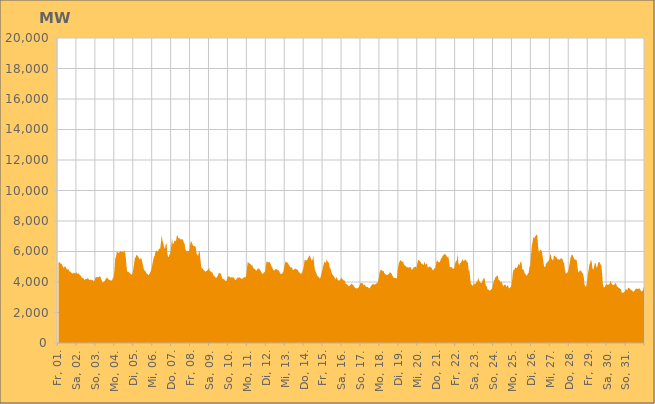
| Category | Series 0 |
|---|---|
|  Fr, 01.  | 5291.469 |
|  Fr, 01.  | 5276.043 |
|  Fr, 01.  | 5301.594 |
|  Fr, 01.  | 5173.904 |
|  Fr, 01.  | 5225.617 |
|  Fr, 01.  | 5091.954 |
|  Fr, 01.  | 4968.742 |
|  Fr, 01.  | 4932.881 |
|  Fr, 01.  | 5008.292 |
|  Fr, 01.  | 5014.87 |
|  Fr, 01.  | 4885.486 |
|  Fr, 01.  | 4801.609 |
|  Fr, 01.  | 4848.167 |
|  Fr, 01.  | 4813.785 |
|  Fr, 01.  | 4692.082 |
|  Fr, 01.  | 4688.042 |
|  Fr, 01.  | 4625.284 |
|  Sa, 02.  | 4578.245 |
|  Sa, 02.  | 4545.249 |
|  Sa, 02.  | 4586.036 |
|  Sa, 02.  | 4613.374 |
|  Sa, 02.  | 4543.371 |
|  Sa, 02.  | 4603.964 |
|  Sa, 02.  | 4637.983 |
|  Sa, 02.  | 4507.018 |
|  Sa, 02.  | 4592.123 |
|  Sa, 02.  | 4522.294 |
|  Sa, 02.  | 4466.594 |
|  Sa, 02.  | 4428.803 |
|  Sa, 02.  | 4359.241 |
|  Sa, 02.  | 4249.046 |
|  Sa, 02.  | 4277.152 |
|  Sa, 02.  | 4220.187 |
|  Sa, 02.  | 4119.785 |
|  Sa, 02.  | 4180.362 |
|  Sa, 02.  | 4197.942 |
|  Sa, 02.  | 4198.519 |
|  Sa, 02.  | 4255.213 |
|  Sa, 02.  | 4222.357 |
|  Sa, 02.  | 4127.056 |
|  Sa, 02.  | 4136.769 |
|  So, 03.  | 4172.317 |
|  So, 03.  | 4118.15 |
|  So, 03.  | 4125.26 |
|  So, 03.  | 4103.695 |
|  So, 03.  | 4032.138 |
|  So, 03.  | 4127.129 |
|  So, 03.  | 4299.63 |
|  So, 03.  | 4323.396 |
|  So, 03.  | 4300.99 |
|  So, 03.  | 4329.813 |
|  So, 03.  | 4302.576 |
|  So, 03.  | 4379.149 |
|  So, 03.  | 4378.963 |
|  So, 03.  | 4217.045 |
|  So, 03.  | 4101.995 |
|  So, 03.  | 3958.755 |
|  So, 03.  | 3994.449 |
|  So, 03.  | 4024.42 |
|  So, 03.  | 4104.761 |
|  So, 03.  | 4195.336 |
|  So, 03.  | 4278.51 |
|  So, 03.  | 4292.641 |
|  So, 03.  | 4183.957 |
|  So, 03.  | 4163.871 |
|  Mo, 04.  | 4133.741 |
|  Mo, 04.  | 4103.664 |
|  Mo, 04.  | 4103.346 |
|  Mo, 04.  | 4096.219 |
|  Mo, 04.  | 4254.713 |
|  Mo, 04.  | 4299.105 |
|  Mo, 04.  | 4738.072 |
|  Mo, 04.  | 5545.968 |
|  Mo, 04.  | 5653.292 |
|  Mo, 04.  | 5981.314 |
|  Mo, 04.  | 5961.216 |
|  Mo, 04.  | 5895.655 |
|  Mo, 04.  | 5958.478 |
|  Mo, 04.  | 5952.697 |
|  Mo, 04.  | 6036.834 |
|  Mo, 04.  | 5975.553 |
|  Mo, 04.  | 5989.244 |
|  Mo, 04.  | 5980.394 |
|  Mo, 04.  | 5938.9 |
|  Mo, 04.  | 6090.2 |
|  Mo, 04.  | 5821.564 |
|  Mo, 04.  | 5229.605 |
|  Mo, 04.  | 4706.197 |
|  Mo, 04.  | 4651.199 |
|  Di, 05.  | 4662.917 |
|  Di, 05.  | 4606.434 |
|  Di, 05.  | 4552.005 |
|  Di, 05.  | 4504.171 |
|  Di, 05.  | 4488.125 |
|  Di, 05.  | 4583.404 |
|  Di, 05.  | 4830.708 |
|  Di, 05.  | 5233.801 |
|  Di, 05.  | 5590.071 |
|  Di, 05.  | 5606.75 |
|  Di, 05.  | 5809.221 |
|  Di, 05.  | 5733.045 |
|  Di, 05.  | 5684.587 |
|  Di, 05.  | 5579.807 |
|  Di, 05.  | 5460.334 |
|  Di, 05.  | 5555.59 |
|  Di, 05.  | 5564.182 |
|  Di, 05.  | 5398.15 |
|  Di, 05.  | 5142.537 |
|  Di, 05.  | 4889.304 |
|  Di, 05.  | 4754.593 |
|  Di, 05.  | 4742.456 |
|  Di, 05.  | 4635.684 |
|  Di, 05.  | 4545.6 |
|  Mi, 06.  | 4537.559 |
|  Mi, 06.  | 4439.4 |
|  Mi, 06.  | 4503.256 |
|  Mi, 06.  | 4587.209 |
|  Mi, 06.  | 4696.493 |
|  Mi, 06.  | 4862.963 |
|  Mi, 06.  | 5138.464 |
|  Mi, 06.  | 5388.065 |
|  Mi, 06.  | 5627.184 |
|  Mi, 06.  | 5707.782 |
|  Mi, 06.  | 5960.912 |
|  Mi, 06.  | 6061.667 |
|  Mi, 06.  | 6028.991 |
|  Mi, 06.  | 5976.684 |
|  Mi, 06.  | 6119.054 |
|  Mi, 06.  | 6195.808 |
|  Mi, 06.  | 6187.889 |
|  Mi, 06.  | 6605.273 |
|  Mi, 06.  | 7073.313 |
|  Mi, 06.  | 6684.127 |
|  Mi, 06.  | 6542.447 |
|  Mi, 06.  | 6286.787 |
|  Mi, 06.  | 6184.092 |
|  Mi, 06.  | 6445.151 |
|  Do, 07.  | 6587.147 |
|  Do, 07.  | 5914.482 |
|  Do, 07.  | 5635.862 |
|  Do, 07.  | 5663.02 |
|  Do, 07.  | 5815.403 |
|  Do, 07.  | 5923.338 |
|  Do, 07.  | 6342.19 |
|  Do, 07.  | 6869.14 |
|  Do, 07.  | 6444.262 |
|  Do, 07.  | 6538.006 |
|  Do, 07.  | 6687.115 |
|  Do, 07.  | 6729.043 |
|  Do, 07.  | 6659.286 |
|  Do, 07.  | 7012.51 |
|  Do, 07.  | 7048.649 |
|  Do, 07.  | 6866.113 |
|  Do, 07.  | 6895.257 |
|  Do, 07.  | 6796.335 |
|  Do, 07.  | 6810.923 |
|  Do, 07.  | 6803.831 |
|  Do, 07.  | 6794.889 |
|  Do, 07.  | 6765.144 |
|  Do, 07.  | 6573.657 |
|  Do, 07.  | 6489.901 |
|  Fr, 08.  | 6135.687 |
|  Fr, 08.  | 6055.58 |
|  Fr, 08.  | 5994.931 |
|  Fr, 08.  | 6070.119 |
|  Fr, 08.  | 6012.673 |
|  Fr, 08.  | 6071.994 |
|  Fr, 08.  | 6430.743 |
|  Fr, 08.  | 6691.765 |
|  Fr, 08.  | 6602.691 |
|  Fr, 08.  | 6475.479 |
|  Fr, 08.  | 6353.714 |
|  Fr, 08.  | 6368.663 |
|  Fr, 08.  | 6342.117 |
|  Fr, 08.  | 6295.964 |
|  Fr, 08.  | 5887.557 |
|  Fr, 08.  | 5782.339 |
|  Fr, 08.  | 5706.268 |
|  Fr, 08.  | 5987.931 |
|  Fr, 08.  | 6035.067 |
|  Fr, 08.  | 5466.929 |
|  Fr, 08.  | 4998.89 |
|  Fr, 08.  | 4890.859 |
|  Fr, 08.  | 4876.809 |
|  Fr, 08.  | 4780.198 |
|  Sa, 09.  | 4744.632 |
|  Sa, 09.  | 4680.274 |
|  Sa, 09.  | 4696.373 |
|  Sa, 09.  | 4729.128 |
|  Sa, 09.  | 4784.888 |
|  Sa, 09.  | 4827.428 |
|  Sa, 09.  | 4937.839 |
|  Sa, 09.  | 4694.053 |
|  Sa, 09.  | 4713.192 |
|  Sa, 09.  | 4626.582 |
|  Sa, 09.  | 4664.275 |
|  Sa, 09.  | 4487.8 |
|  Sa, 09.  | 4421.121 |
|  Sa, 09.  | 4367.827 |
|  Sa, 09.  | 4309.952 |
|  Sa, 09.  | 4254.74 |
|  Sa, 09.  | 4344.46 |
|  Sa, 09.  | 4407.463 |
|  Sa, 09.  | 4555.946 |
|  Sa, 09.  | 4604.682 |
|  Sa, 09.  | 4563.197 |
|  Sa, 09.  | 4552.78 |
|  Sa, 09.  | 4330.725 |
|  Sa, 09.  | 4220.917 |
|  So, 10.  | 4180.428 |
|  So, 10.  | 4191.513 |
|  So, 10.  | 4101.49 |
|  So, 10.  | 4077.535 |
|  So, 10.  | 4047.731 |
|  So, 10.  | 4283.512 |
|  So, 10.  | 4354.039 |
|  So, 10.  | 4373.593 |
|  So, 10.  | 4337.934 |
|  So, 10.  | 4290.05 |
|  So, 10.  | 4276.678 |
|  So, 10.  | 4356.916 |
|  So, 10.  | 4264.461 |
|  So, 10.  | 4321.378 |
|  So, 10.  | 4226.378 |
|  So, 10.  | 4145.911 |
|  So, 10.  | 4122.615 |
|  So, 10.  | 4235.008 |
|  So, 10.  | 4268.223 |
|  So, 10.  | 4311.535 |
|  So, 10.  | 4278.406 |
|  So, 10.  | 4300.952 |
|  So, 10.  | 4250.296 |
|  So, 10.  | 4204.545 |
|  Mo, 11.  | 4235.616 |
|  Mo, 11.  | 4236.421 |
|  Mo, 11.  | 4295.789 |
|  Mo, 11.  | 4337.494 |
|  Mo, 11.  | 4284.898 |
|  Mo, 11.  | 4437.121 |
|  Mo, 11.  | 4913.883 |
|  Mo, 11.  | 5333.347 |
|  Mo, 11.  | 5264.984 |
|  Mo, 11.  | 5239.085 |
|  Mo, 11.  | 5155.236 |
|  Mo, 11.  | 5179.765 |
|  Mo, 11.  | 5065.546 |
|  Mo, 11.  | 5092.535 |
|  Mo, 11.  | 4915.994 |
|  Mo, 11.  | 4879.941 |
|  Mo, 11.  | 4840.545 |
|  Mo, 11.  | 4775.718 |
|  Mo, 11.  | 4736.119 |
|  Mo, 11.  | 4826.88 |
|  Mo, 11.  | 4890.467 |
|  Mo, 11.  | 4880.201 |
|  Mo, 11.  | 4843.617 |
|  Mo, 11.  | 4752.941 |
|  Di, 12.  | 4649.625 |
|  Di, 12.  | 4567.933 |
|  Di, 12.  | 4538.856 |
|  Di, 12.  | 4573.958 |
|  Di, 12.  | 4634.146 |
|  Di, 12.  | 4699.932 |
|  Di, 12.  | 5079.319 |
|  Di, 12.  | 5366.886 |
|  Di, 12.  | 5330.487 |
|  Di, 12.  | 5264.685 |
|  Di, 12.  | 5325.842 |
|  Di, 12.  | 5281.825 |
|  Di, 12.  | 5180.592 |
|  Di, 12.  | 5037.448 |
|  Di, 12.  | 4981.999 |
|  Di, 12.  | 4811.019 |
|  Di, 12.  | 4765.238 |
|  Di, 12.  | 4745.653 |
|  Di, 12.  | 4851.761 |
|  Di, 12.  | 4840.736 |
|  Di, 12.  | 4830.962 |
|  Di, 12.  | 4773.484 |
|  Di, 12.  | 4758.342 |
|  Di, 12.  | 4692.597 |
|  Mi, 13.  | 4579.489 |
|  Mi, 13.  | 4527.023 |
|  Mi, 13.  | 4527.324 |
|  Mi, 13.  | 4593.616 |
|  Mi, 13.  | 4657.164 |
|  Mi, 13.  | 4885.976 |
|  Mi, 13.  | 5186.799 |
|  Mi, 13.  | 5353.901 |
|  Mi, 13.  | 5288.894 |
|  Mi, 13.  | 5288.684 |
|  Mi, 13.  | 5229.054 |
|  Mi, 13.  | 5124.695 |
|  Mi, 13.  | 5069.744 |
|  Mi, 13.  | 4939.139 |
|  Mi, 13.  | 4971.942 |
|  Mi, 13.  | 4930.55 |
|  Mi, 13.  | 4808.885 |
|  Mi, 13.  | 4787.267 |
|  Mi, 13.  | 4823.626 |
|  Mi, 13.  | 4874.976 |
|  Mi, 13.  | 4874.868 |
|  Mi, 13.  | 4824.262 |
|  Mi, 13.  | 4823.295 |
|  Mi, 13.  | 4740.596 |
|  Do, 14.  | 4614.358 |
|  Do, 14.  | 4618.726 |
|  Do, 14.  | 4535.939 |
|  Do, 14.  | 4553.421 |
|  Do, 14.  | 4633.622 |
|  Do, 14.  | 4800.123 |
|  Do, 14.  | 4998.901 |
|  Do, 14.  | 5426.598 |
|  Do, 14.  | 5431.75 |
|  Do, 14.  | 5442.785 |
|  Do, 14.  | 5399.831 |
|  Do, 14.  | 5538.743 |
|  Do, 14.  | 5622.713 |
|  Do, 14.  | 5740.719 |
|  Do, 14.  | 5705.517 |
|  Do, 14.  | 5547.116 |
|  Do, 14.  | 5385.495 |
|  Do, 14.  | 5446.106 |
|  Do, 14.  | 5748.418 |
|  Do, 14.  | 5265.14 |
|  Do, 14.  | 4829.787 |
|  Do, 14.  | 4679.741 |
|  Do, 14.  | 4578.058 |
|  Do, 14.  | 4425.641 |
|  Fr, 15.  | 4361.324 |
|  Fr, 15.  | 4318.628 |
|  Fr, 15.  | 4227.312 |
|  Fr, 15.  | 4266.392 |
|  Fr, 15.  | 4466.236 |
|  Fr, 15.  | 4678.234 |
|  Fr, 15.  | 4877.404 |
|  Fr, 15.  | 5119.952 |
|  Fr, 15.  | 5315.471 |
|  Fr, 15.  | 5332.993 |
|  Fr, 15.  | 5220.811 |
|  Fr, 15.  | 5498.347 |
|  Fr, 15.  | 5365.843 |
|  Fr, 15.  | 5291.933 |
|  Fr, 15.  | 5228.38 |
|  Fr, 15.  | 4908.942 |
|  Fr, 15.  | 4882.227 |
|  Fr, 15.  | 4652.13 |
|  Fr, 15.  | 4496.603 |
|  Fr, 15.  | 4458.48 |
|  Fr, 15.  | 4388.897 |
|  Fr, 15.  | 4291.888 |
|  Fr, 15.  | 4172.935 |
|  Fr, 15.  | 4275.231 |
|  Sa, 16.  | 4313.048 |
|  Sa, 16.  | 4136.575 |
|  Sa, 16.  | 4104.573 |
|  Sa, 16.  | 4094.865 |
|  Sa, 16.  | 4137.976 |
|  Sa, 16.  | 4220.746 |
|  Sa, 16.  | 4293.454 |
|  Sa, 16.  | 4178.676 |
|  Sa, 16.  | 4142.249 |
|  Sa, 16.  | 4078.085 |
|  Sa, 16.  | 4109.875 |
|  Sa, 16.  | 3909.607 |
|  Sa, 16.  | 3861.206 |
|  Sa, 16.  | 3839.752 |
|  Sa, 16.  | 3782.949 |
|  Sa, 16.  | 3708.857 |
|  Sa, 16.  | 3761.187 |
|  Sa, 16.  | 3796.296 |
|  Sa, 16.  | 3864.955 |
|  Sa, 16.  | 3883.205 |
|  Sa, 16.  | 3816.827 |
|  Sa, 16.  | 3778.163 |
|  Sa, 16.  | 3683.69 |
|  Sa, 16.  | 3607.816 |
|  So, 17.  | 3610.389 |
|  So, 17.  | 3567.522 |
|  So, 17.  | 3598.465 |
|  So, 17.  | 3632.37 |
|  So, 17.  | 3688.88 |
|  So, 17.  | 3830.671 |
|  So, 17.  | 3926.059 |
|  So, 17.  | 3937.982 |
|  So, 17.  | 3931.533 |
|  So, 17.  | 3882.857 |
|  So, 17.  | 3771 |
|  So, 17.  | 3823.936 |
|  So, 17.  | 3763.022 |
|  So, 17.  | 3693.486 |
|  So, 17.  | 3666.028 |
|  So, 17.  | 3684.295 |
|  So, 17.  | 3622.725 |
|  So, 17.  | 3582.982 |
|  So, 17.  | 3612.354 |
|  So, 17.  | 3735.524 |
|  So, 17.  | 3783.699 |
|  So, 17.  | 3832.545 |
|  So, 17.  | 3895.17 |
|  So, 17.  | 3824.425 |
|  Mo, 18.  | 3840.829 |
|  Mo, 18.  | 3866.18 |
|  Mo, 18.  | 3916.215 |
|  Mo, 18.  | 3917.128 |
|  Mo, 18.  | 4027.077 |
|  Mo, 18.  | 4271.925 |
|  Mo, 18.  | 4585.956 |
|  Mo, 18.  | 4768.349 |
|  Mo, 18.  | 4773.712 |
|  Mo, 18.  | 4805.654 |
|  Mo, 18.  | 4677.848 |
|  Mo, 18.  | 4763.289 |
|  Mo, 18.  | 4576.879 |
|  Mo, 18.  | 4533.412 |
|  Mo, 18.  | 4494.002 |
|  Mo, 18.  | 4454.415 |
|  Mo, 18.  | 4478.97 |
|  Mo, 18.  | 4488.245 |
|  Mo, 18.  | 4549.973 |
|  Mo, 18.  | 4643.844 |
|  Mo, 18.  | 4614.16 |
|  Mo, 18.  | 4571.046 |
|  Mo, 18.  | 4446.581 |
|  Mo, 18.  | 4363.413 |
|  Di, 19.  | 4263.979 |
|  Di, 19.  | 4259.863 |
|  Di, 19.  | 4260.511 |
|  Di, 19.  | 4247.121 |
|  Di, 19.  | 4256.344 |
|  Di, 19.  | 4769.993 |
|  Di, 19.  | 5098.365 |
|  Di, 19.  | 5297.308 |
|  Di, 19.  | 5400.579 |
|  Di, 19.  | 5437.197 |
|  Di, 19.  | 5354.435 |
|  Di, 19.  | 5323.21 |
|  Di, 19.  | 5324.916 |
|  Di, 19.  | 5142.137 |
|  Di, 19.  | 5075.804 |
|  Di, 19.  | 5064.138 |
|  Di, 19.  | 4989.661 |
|  Di, 19.  | 4976.736 |
|  Di, 19.  | 4949.87 |
|  Di, 19.  | 4936.667 |
|  Di, 19.  | 4992.186 |
|  Di, 19.  | 4988.823 |
|  Di, 19.  | 4885.527 |
|  Di, 19.  | 4783.797 |
|  Mi, 20.  | 4830.174 |
|  Mi, 20.  | 4955.418 |
|  Mi, 20.  | 4965.93 |
|  Mi, 20.  | 4986.813 |
|  Mi, 20.  | 5007.961 |
|  Mi, 20.  | 4910.888 |
|  Mi, 20.  | 5235.865 |
|  Mi, 20.  | 5442.828 |
|  Mi, 20.  | 5450.456 |
|  Mi, 20.  | 5369.023 |
|  Mi, 20.  | 5317.188 |
|  Mi, 20.  | 5197.408 |
|  Mi, 20.  | 5216.083 |
|  Mi, 20.  | 5147.714 |
|  Mi, 20.  | 5106.926 |
|  Mi, 20.  | 5364.291 |
|  Mi, 20.  | 5125.331 |
|  Mi, 20.  | 5170.957 |
|  Mi, 20.  | 5238.198 |
|  Mi, 20.  | 4967.688 |
|  Mi, 20.  | 4948.95 |
|  Mi, 20.  | 4999.192 |
|  Mi, 20.  | 5027.567 |
|  Mi, 20.  | 4950.358 |
|  Do, 21.  | 4951.871 |
|  Do, 21.  | 4785.188 |
|  Do, 21.  | 4770.32 |
|  Do, 21.  | 4845.133 |
|  Do, 21.  | 4909.556 |
|  Do, 21.  | 4950.662 |
|  Do, 21.  | 5283.096 |
|  Do, 21.  | 5450.001 |
|  Do, 21.  | 5328.209 |
|  Do, 21.  | 5310.289 |
|  Do, 21.  | 5274.427 |
|  Do, 21.  | 5379.917 |
|  Do, 21.  | 5549.625 |
|  Do, 21.  | 5564.577 |
|  Do, 21.  | 5721.566 |
|  Do, 21.  | 5752.647 |
|  Do, 21.  | 5799.135 |
|  Do, 21.  | 5853.072 |
|  Do, 21.  | 5786.828 |
|  Do, 21.  | 5699.918 |
|  Do, 21.  | 5599.815 |
|  Do, 21.  | 5713.752 |
|  Do, 21.  | 5428.096 |
|  Do, 21.  | 4965.753 |
|  Fr, 22.  | 4975.218 |
|  Fr, 22.  | 4993.49 |
|  Fr, 22.  | 4931.168 |
|  Fr, 22.  | 4860.604 |
|  Fr, 22.  | 4870.92 |
|  Fr, 22.  | 4958.054 |
|  Fr, 22.  | 5254.68 |
|  Fr, 22.  | 5357.625 |
|  Fr, 22.  | 5417.202 |
|  Fr, 22.  | 5834.296 |
|  Fr, 22.  | 5238.072 |
|  Fr, 22.  | 5103.086 |
|  Fr, 22.  | 5238.044 |
|  Fr, 22.  | 5255.883 |
|  Fr, 22.  | 5359.341 |
|  Fr, 22.  | 5508.85 |
|  Fr, 22.  | 5394.796 |
|  Fr, 22.  | 5373.416 |
|  Fr, 22.  | 5455.424 |
|  Fr, 22.  | 5464.886 |
|  Fr, 22.  | 5395.778 |
|  Fr, 22.  | 5317.938 |
|  Fr, 22.  | 5270.915 |
|  Fr, 22.  | 4743.584 |
|  Sa, 23.  | 4792.909 |
|  Sa, 23.  | 4171.756 |
|  Sa, 23.  | 3845.78 |
|  Sa, 23.  | 3834.244 |
|  Sa, 23.  | 3743.006 |
|  Sa, 23.  | 3792.704 |
|  Sa, 23.  | 3923.86 |
|  Sa, 23.  | 3840.087 |
|  Sa, 23.  | 3933.366 |
|  Sa, 23.  | 4002.701 |
|  Sa, 23.  | 4031.04 |
|  Sa, 23.  | 4272.239 |
|  Sa, 23.  | 4123.543 |
|  Sa, 23.  | 4023.937 |
|  Sa, 23.  | 3940.226 |
|  Sa, 23.  | 3942.673 |
|  Sa, 23.  | 3982.459 |
|  Sa, 23.  | 4161.178 |
|  Sa, 23.  | 4237.775 |
|  Sa, 23.  | 4271.399 |
|  Sa, 23.  | 3957.864 |
|  Sa, 23.  | 3724.891 |
|  Sa, 23.  | 3716.361 |
|  Sa, 23.  | 3509.171 |
|  So, 24.  | 3517.345 |
|  So, 24.  | 3456.407 |
|  So, 24.  | 3427.551 |
|  So, 24.  | 3485.856 |
|  So, 24.  | 3535.263 |
|  So, 24.  | 3638.615 |
|  So, 24.  | 3884.821 |
|  So, 24.  | 4109.682 |
|  So, 24.  | 4169.471 |
|  So, 24.  | 4330.723 |
|  So, 24.  | 4343.43 |
|  So, 24.  | 4423.269 |
|  So, 24.  | 4395.392 |
|  So, 24.  | 4133.433 |
|  So, 24.  | 4116.61 |
|  So, 24.  | 4037.763 |
|  So, 24.  | 3945.753 |
|  So, 24.  | 4071.629 |
|  So, 24.  | 3805.69 |
|  So, 24.  | 3703.032 |
|  So, 24.  | 3823.357 |
|  So, 24.  | 3815.128 |
|  So, 24.  | 3805.988 |
|  So, 24.  | 3650.976 |
|  Mo, 25.  | 3791.234 |
|  Mo, 25.  | 3742.921 |
|  Mo, 25.  | 3579.914 |
|  Mo, 25.  | 3602.676 |
|  Mo, 25.  | 3657.078 |
|  Mo, 25.  | 3756.468 |
|  Mo, 25.  | 4069.796 |
|  Mo, 25.  | 4623.166 |
|  Mo, 25.  | 4814.201 |
|  Mo, 25.  | 4808.69 |
|  Mo, 25.  | 4967.069 |
|  Mo, 25.  | 4927.626 |
|  Mo, 25.  | 4908.788 |
|  Mo, 25.  | 4998.384 |
|  Mo, 25.  | 5194.316 |
|  Mo, 25.  | 5083.246 |
|  Mo, 25.  | 5206.511 |
|  Mo, 25.  | 5359.074 |
|  Mo, 25.  | 5229.752 |
|  Mo, 25.  | 4806.323 |
|  Mo, 25.  | 4821.086 |
|  Mo, 25.  | 4763.114 |
|  Mo, 25.  | 4560.445 |
|  Mo, 25.  | 4522.046 |
|  Di, 26.  | 4435.983 |
|  Di, 26.  | 4404.189 |
|  Di, 26.  | 4559.486 |
|  Di, 26.  | 4611.625 |
|  Di, 26.  | 4965.988 |
|  Di, 26.  | 5071.465 |
|  Di, 26.  | 5737.764 |
|  Di, 26.  | 6336.021 |
|  Di, 26.  | 6635.883 |
|  Di, 26.  | 6982.487 |
|  Di, 26.  | 6853.079 |
|  Di, 26.  | 6960.365 |
|  Di, 26.  | 7034.617 |
|  Di, 26.  | 7113.892 |
|  Di, 26.  | 7067.768 |
|  Di, 26.  | 6351.612 |
|  Di, 26.  | 5940.089 |
|  Di, 26.  | 6055.158 |
|  Di, 26.  | 6125.893 |
|  Di, 26.  | 6064.395 |
|  Di, 26.  | 5952.529 |
|  Di, 26.  | 5590.144 |
|  Di, 26.  | 5212.429 |
|  Di, 26.  | 4983.379 |
|  Mi, 27.  | 4983.297 |
|  Mi, 27.  | 5184.248 |
|  Mi, 27.  | 5255.608 |
|  Mi, 27.  | 5329.341 |
|  Mi, 27.  | 5361.03 |
|  Mi, 27.  | 5451.61 |
|  Mi, 27.  | 5695.093 |
|  Mi, 27.  | 5871.901 |
|  Mi, 27.  | 5504.277 |
|  Mi, 27.  | 5476.401 |
|  Mi, 27.  | 5388.185 |
|  Mi, 27.  | 5711.272 |
|  Mi, 27.  | 5739.211 |
|  Mi, 27.  | 5649.24 |
|  Mi, 27.  | 5641.094 |
|  Mi, 27.  | 5535.987 |
|  Mi, 27.  | 5466.45 |
|  Mi, 27.  | 5493.254 |
|  Mi, 27.  | 5457.395 |
|  Mi, 27.  | 5513.861 |
|  Mi, 27.  | 5532.065 |
|  Mi, 27.  | 5563.833 |
|  Mi, 27.  | 5495.541 |
|  Mi, 27.  | 5302.224 |
|  Do, 28.  | 5241.761 |
|  Do, 28.  | 4822.731 |
|  Do, 28.  | 4541.306 |
|  Do, 28.  | 4582.296 |
|  Do, 28.  | 4606.169 |
|  Do, 28.  | 4690.981 |
|  Do, 28.  | 4946.378 |
|  Do, 28.  | 5228.795 |
|  Do, 28.  | 5559.976 |
|  Do, 28.  | 5741.432 |
|  Do, 28.  | 5808.239 |
|  Do, 28.  | 5727.655 |
|  Do, 28.  | 5614.612 |
|  Do, 28.  | 5481.576 |
|  Do, 28.  | 5486.11 |
|  Do, 28.  | 5441.239 |
|  Do, 28.  | 5418.32 |
|  Do, 28.  | 4953.985 |
|  Do, 28.  | 4620.74 |
|  Do, 28.  | 4675.503 |
|  Do, 28.  | 4749.543 |
|  Do, 28.  | 4765.011 |
|  Do, 28.  | 4683.786 |
|  Do, 28.  | 4594.229 |
|  Fr, 29.  | 4545.585 |
|  Fr, 29.  | 4281.704 |
|  Fr, 29.  | 3800.214 |
|  Fr, 29.  | 3713.027 |
|  Fr, 29.  | 3712.112 |
|  Fr, 29.  | 3979.234 |
|  Fr, 29.  | 4500.353 |
|  Fr, 29.  | 4775.335 |
|  Fr, 29.  | 5122.213 |
|  Fr, 29.  | 5255.492 |
|  Fr, 29.  | 5485.378 |
|  Fr, 29.  | 5276.879 |
|  Fr, 29.  | 4863.557 |
|  Fr, 29.  | 4813.437 |
|  Fr, 29.  | 5008.736 |
|  Fr, 29.  | 5248.815 |
|  Fr, 29.  | 5213.418 |
|  Fr, 29.  | 4935.091 |
|  Fr, 29.  | 4977.25 |
|  Fr, 29.  | 5223.562 |
|  Fr, 29.  | 5333.765 |
|  Fr, 29.  | 5292.441 |
|  Fr, 29.  | 5173.395 |
|  Fr, 29.  | 5089.643 |
|  Sa, 30.  | 4708.067 |
|  Sa, 30.  | 3890.622 |
|  Sa, 30.  | 3662.162 |
|  Sa, 30.  | 3658.828 |
|  Sa, 30.  | 3710.286 |
|  Sa, 30.  | 3800.907 |
|  Sa, 30.  | 3890.321 |
|  Sa, 30.  | 3809.674 |
|  Sa, 30.  | 3820.02 |
|  Sa, 30.  | 3852.651 |
|  Sa, 30.  | 3917.47 |
|  Sa, 30.  | 4095.357 |
|  Sa, 30.  | 3906.23 |
|  Sa, 30.  | 3829.251 |
|  Sa, 30.  | 3796.008 |
|  Sa, 30.  | 3793.226 |
|  Sa, 30.  | 3851.65 |
|  Sa, 30.  | 3935.799 |
|  Sa, 30.  | 3865.708 |
|  Sa, 30.  | 3706.948 |
|  Sa, 30.  | 3677.465 |
|  Sa, 30.  | 3614.778 |
|  Sa, 30.  | 3622.332 |
|  Sa, 30.  | 3544.917 |
|  So, 31.  | 3537.437 |
|  So, 31.  | 3298.34 |
|  So, 31.  | 3297.457 |
|  So, 31.  | 3310.335 |
|  So, 31.  | 3316.024 |
|  So, 31.  | 3401.211 |
|  So, 31.  | 3514.643 |
|  So, 31.  | 3528.806 |
|  So, 31.  | 3452.954 |
|  So, 31.  | 3600.648 |
|  So, 31.  | 3635.298 |
|  So, 31.  | 3579.17 |
|  So, 31.  | 3518.487 |
|  So, 31.  | 3479.478 |
|  So, 31.  | 3446.54 |
|  So, 31.  | 3390.897 |
|  So, 31.  | 3354.979 |
|  So, 31.  | 3425.984 |
|  So, 31.  | 3493.324 |
|  So, 31.  | 3553.247 |
|  So, 31.  | 3578.814 |
|  So, 31.  | 3549.784 |
|  So, 31.  | 3538.901 |
|  So, 31.  | 3577.181 |
|  Mo, 01.  | 3563.124 |
|  Mo, 01.  | 3441.543 |
|  Mo, 01.  | 3380.873 |
|  Mo, 01.  | 3392.514 |
|  Mo, 01.  | 3478.983 |
|  Mo, 01.  | 3643.084 |